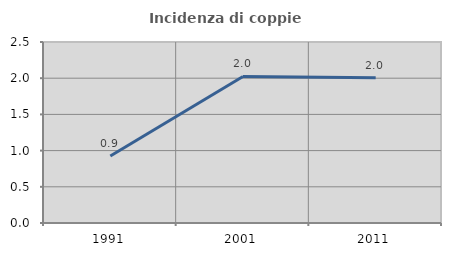
| Category | Incidenza di coppie miste |
|---|---|
| 1991.0 | 0.924 |
| 2001.0 | 2.024 |
| 2011.0 | 2.008 |